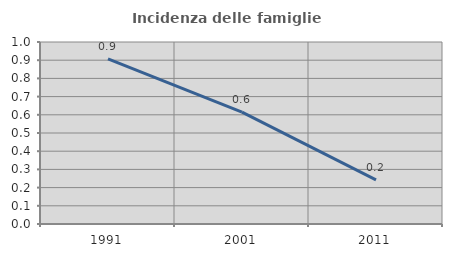
| Category | Incidenza delle famiglie numerose |
|---|---|
| 1991.0 | 0.907 |
| 2001.0 | 0.615 |
| 2011.0 | 0.243 |